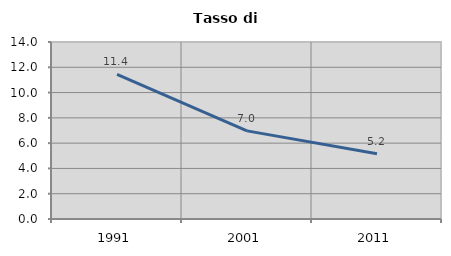
| Category | Tasso di disoccupazione   |
|---|---|
| 1991.0 | 11.443 |
| 2001.0 | 6.971 |
| 2011.0 | 5.162 |